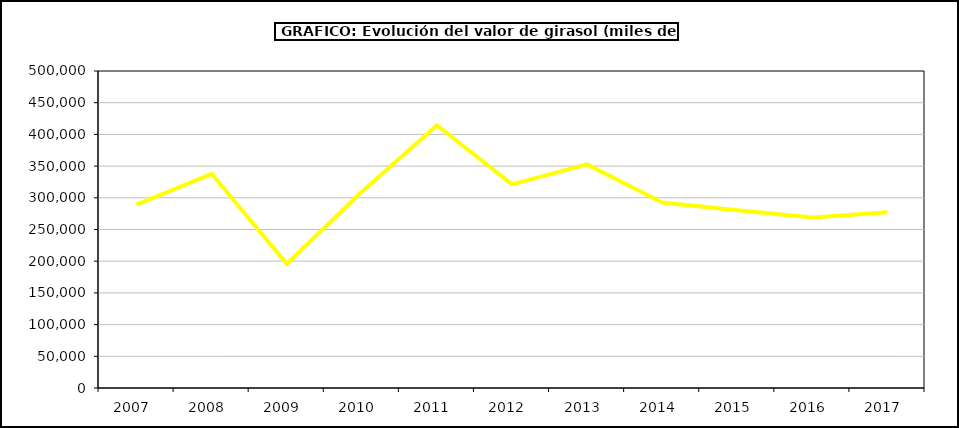
| Category | Valor |
|---|---|
| 2007.0 | 289082.622 |
| 2008.0 | 337817.138 |
| 2009.0 | 195820.408 |
| 2010.0 | 309453.606 |
| 2011.0 | 414373.997 |
| 2012.0 | 321265.307 |
| 2013.0 | 352632.719 |
| 2014.0 | 292566.702 |
| 2015.0 | 280295 |
| 2016.0 | 268873 |
| 2017.0 | 277184.982 |